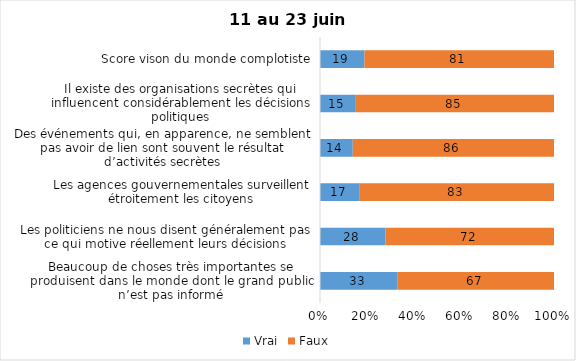
| Category | Vrai | Faux |
|---|---|---|
| Beaucoup de choses très importantes se produisent dans le monde dont le grand public n’est pas informé | 33 | 67 |
| Les politiciens ne nous disent généralement pas ce qui motive réellement leurs décisions | 28 | 72 |
| Les agences gouvernementales surveillent étroitement les citoyens | 17 | 83 |
| Des événements qui, en apparence, ne semblent pas avoir de lien sont souvent le résultat d’activités secrètes | 14 | 86 |
| Il existe des organisations secrètes qui influencent considérablement les décisions politiques | 15 | 85 |
| Score vison du monde complotiste | 19 | 81 |